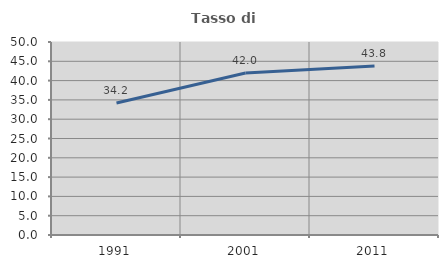
| Category | Tasso di occupazione   |
|---|---|
| 1991.0 | 34.175 |
| 2001.0 | 41.988 |
| 2011.0 | 43.764 |